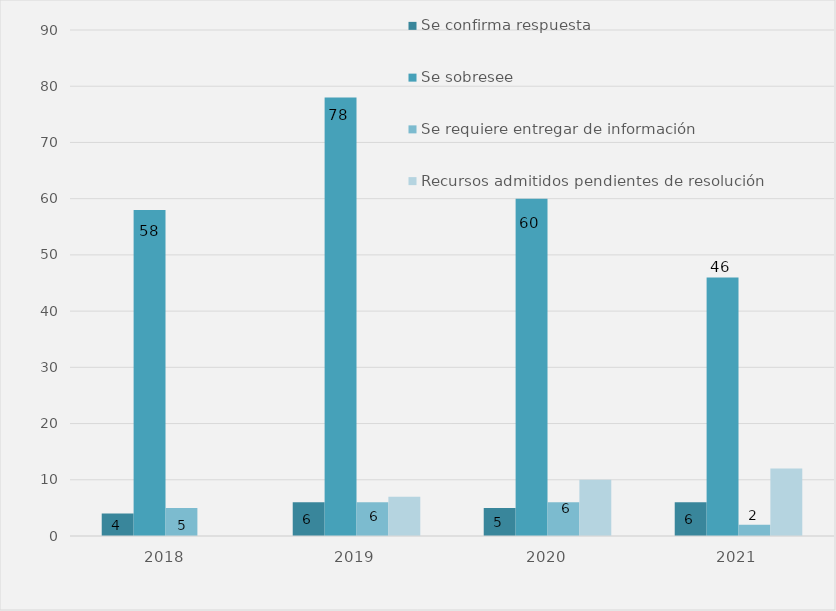
| Category | Se confirma respuesta | Se sobresee  | Se requiere entregar de información  | Recursos admitidos pendientes de resolución |
|---|---|---|---|---|
| 2018.0 | 4 | 58 | 5 | 0 |
| 2019.0 | 6 | 78 | 6 | 7 |
| 2020.0 | 5 | 60 | 6 | 10 |
| 2021.0 | 6 | 46 | 2 | 12 |